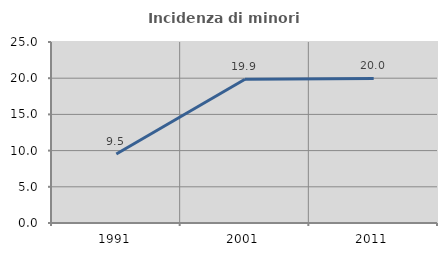
| Category | Incidenza di minori stranieri |
|---|---|
| 1991.0 | 9.524 |
| 2001.0 | 19.858 |
| 2011.0 | 19.97 |